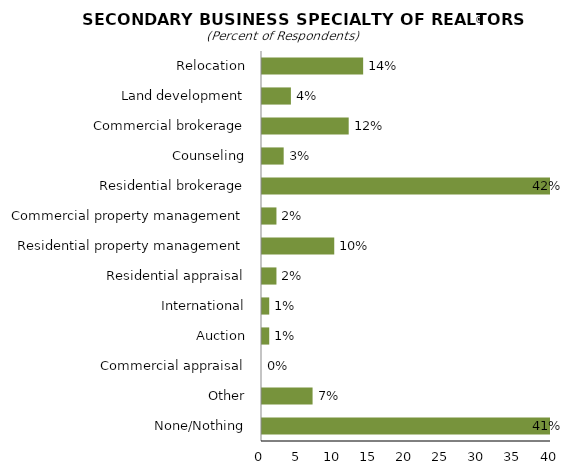
| Category | Series 0 |
|---|---|
| Relocation | 14 |
| Land development | 4 |
| Commercial brokerage | 12 |
| Counseling | 3 |
| Residential brokerage | 42 |
| Commercial property management | 2 |
| Residential property management | 10 |
| Residential appraisal | 2 |
| International | 1 |
| Auction | 1 |
| Commercial appraisal | 0 |
| Other | 7 |
| None/Nothing | 41 |